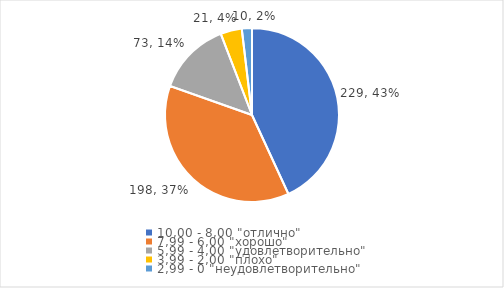
| Category | Series 0 | Series 1 |
|---|---|---|
| 10,00 - 8,00 "отлично" | 229 | 0.431 |
| 7,99 - 6,00 "хорошо" | 198 | 0.373 |
| 5,99 - 4,00 "удовлетворительно" | 73 | 0.137 |
| 3,99 - 2,00 "плохо" | 21 | 0.04 |
| 2,99 - 0 "неудовлетворительно" | 10 | 0.019 |